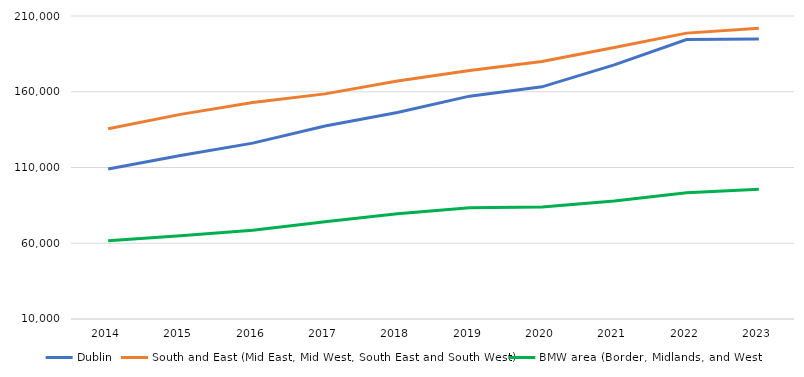
| Category | Dublin | South and East (Mid East, Mid West, South East and South West) | BMW area (Border, Midlands, and West) |
|---|---|---|---|
| 2014.0 | 108955 | 135621 | 61655 |
| 2015.0 | 117965 | 145060 | 64980 |
| 2016.0 | 126099 | 152900 | 68631 |
| 2017.0 | 137351 | 158590 | 74230 |
| 2018.0 | 146296 | 167109 | 79482 |
| 2019.0 | 157101 | 174094 | 83507 |
| 2020.0 | 163245 | 179911 | 83885 |
| 2021.0 | 177760 | 189202 | 87820 |
| 2022.0 | 194509 | 198702 | 93303 |
| 2023.0 | 194816 | 201941 | 95563 |